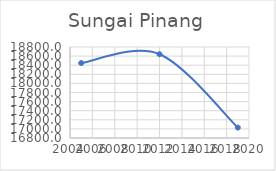
| Category | Series 0 |
|---|---|
| 2005.0 | 18447.193 |
| 2012.0 | 18641.312 |
| 2019.0 | 17028.602 |